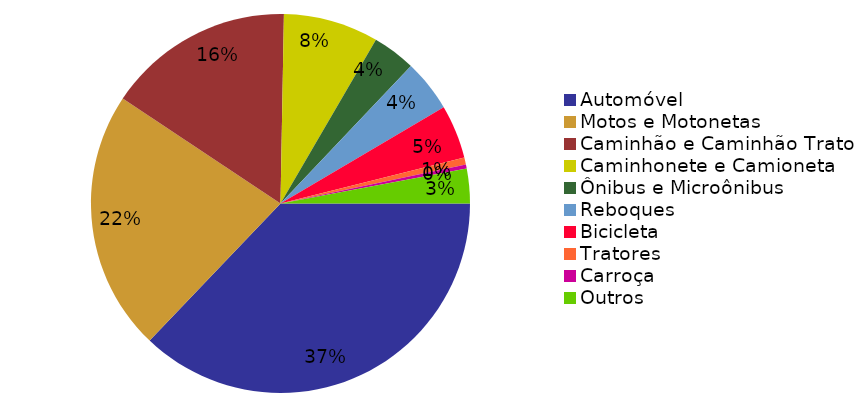
| Category | Qtde Veículos |
|---|---|
| Automóvel | 1190 |
| Motos e Motonetas | 712 |
| Caminhão e Caminhão Trator | 511 |
| Caminhonete e Camioneta | 260 |
| Ônibus e Microônibus | 118 |
| Reboques | 142 |
| Bicicleta | 147 |
| Tratores | 19 |
| Carroça | 11 |
| Outros | 95 |